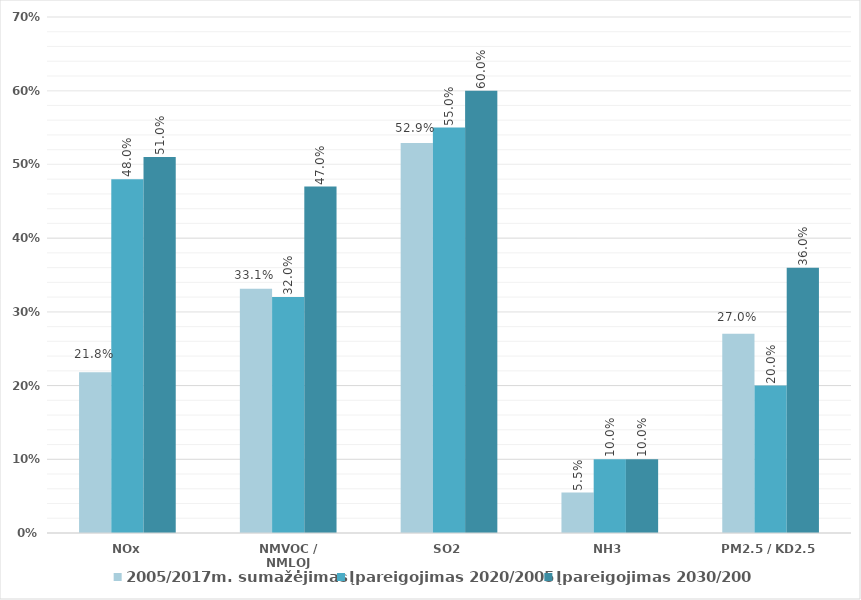
| Category | 2005/2017m. sumažėjimas | Įpareigojimas 2020/2005 | Įpareigojimas 2030/2005 |
|---|---|---|---|
| NOx | 0.218 | 0.48 | 0.51 |
| NMVOC / NMLOJ | 0.331 | 0.32 | 0.47 |
| SO2 | 0.529 | 0.55 | 0.6 |
| NH3 | 0.055 | 0.1 | 0.1 |
| PM2.5 / KD2.5 | 0.27 | 0.2 | 0.36 |